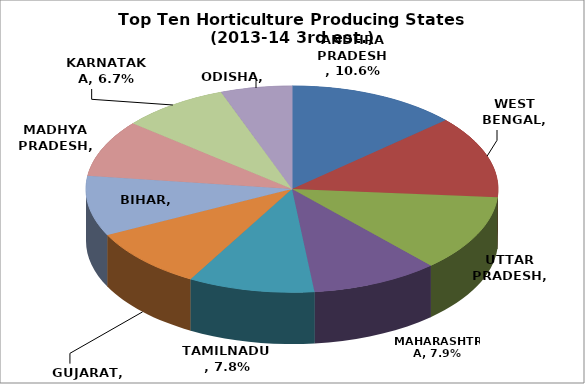
| Category | % Share Production |
|---|---|
| ANDHRA PRADESH | 0.106 |
| WEST BENGAL | 0.102 |
| UTTAR PRADESH | 0.095 |
| MAHARASHTRA | 0.079 |
| TAMILNADU | 0.078 |
| GUJARAT | 0.075 |
| BIHAR | 0.074 |
| MADHYA PRADESH | 0.07 |
| KARNATAKA | 0.067 |
| ODISHA | 0.044 |